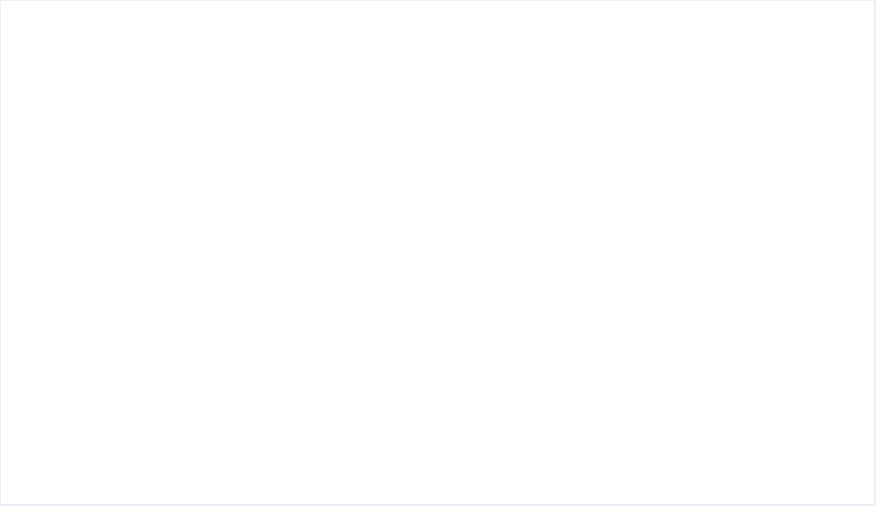
| Category | Passed | Seminars |
|---|---|---|
| 2002 | 42 | 2 |
| 2003 | 90 | 4 |
| 2004 | 84 | 3 |
| 2005 | 58 | 2 |
| 2006 | 16 | 2 |
| 2007 | 56 | 3 |
| 2008 | 77 | 2 |
| 2009 | 131 | 4 |
| 2010 | 69 | 2 |
| 2011 | 81 | 2 |
| 2012 | 86 | 2 |
| 2013 | 76 | 2 |
| 2014 | 79 | 2 |
| 2015 | 83 | 2 |
| 2016 | 79 | 2 |
| 2017 | 66 | 2 |
| 2018 | 52 | 1 |
| 2019 | 56 | 2 |
| 2020 | 47 | 1 |
| 2021 | 229 | 3 |
| 2022 | 127 | 5 |
| 2023 | 222 | 2 |
| 2024 | 151 | 2 |